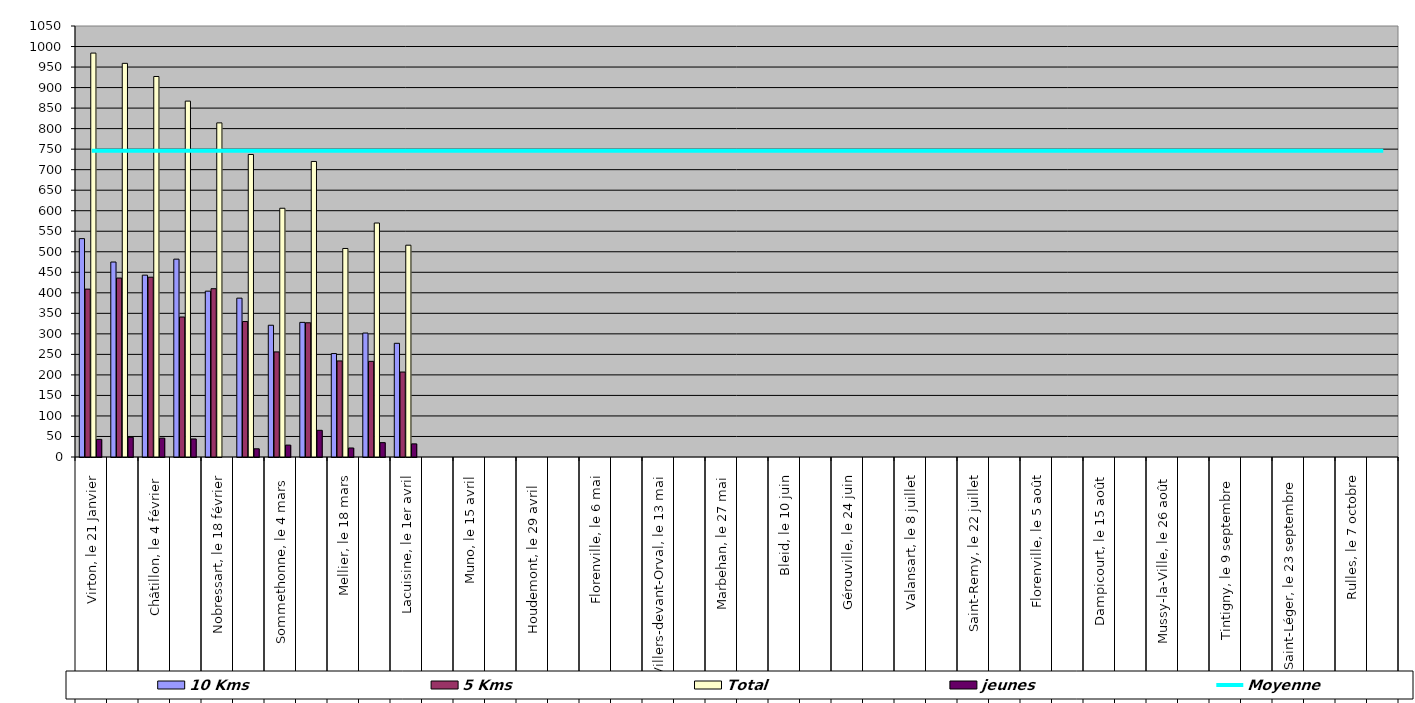
| Category | 10 Kms | 5 Kms | Total | jeunes |
|---|---|---|---|---|
| 0 | 532 | 409 | 984 | 43 |
| 1 | 475 | 436 | 959 | 48 |
| 2 | 443 | 438 | 927 | 46 |
| 3 | 482 | 341 | 867 | 44 |
| 4 | 404 | 410 | 814 | 0 |
| 5 | 387 | 330 | 737 | 20 |
| 6 | 321 | 256 | 606 | 29 |
| 7 | 328 | 327 | 720 | 65 |
| 8 | 252 | 234 | 508 | 22 |
| 9 | 302 | 233 | 570 | 35 |
| 10 | 277 | 207 | 516 | 32 |
| 11 | 0 | 0 | 0 | 0 |
| 12 | 0 | 0 | 0 | 0 |
| 13 | 0 | 0 | 0 | 0 |
| 14 | 0 | 0 | 0 | 0 |
| 15 | 0 | 0 | 0 | 0 |
| 16 | 0 | 0 | 0 | 0 |
| 17 | 0 | 0 | 0 | 0 |
| 18 | 0 | 0 | 0 | 0 |
| 19 | 0 | 0 | 0 | 0 |
| 20 | 0 | 0 | 0 | 0 |
| 21 | 0 | 0 | 0 | 0 |
| 22 | 0 | 0 | 0 | 0 |
| 23 | 0 | 0 | 0 | 0 |
| 24 | 0 | 0 | 0 | 0 |
| 25 | 0 | 0 | 0 | 0 |
| 26 | 0 | 0 | 0 | 0 |
| 27 | 0 | 0 | 0 | 0 |
| 28 | 0 | 0 | 0 | 0 |
| 29 | 0 | 0 | 0 | 0 |
| 30 | 0 | 0 | 0 | 0 |
| 31 | 0 | 0 | 0 | 0 |
| 32 | 0 | 0 | 0 | 0 |
| 33 | 0 | 0 | 0 | 0 |
| 34 | 0 | 0 | 0 | 0 |
| 35 | 0 | 0 | 0 | 0 |
| 36 | 0 | 0 | 0 | 0 |
| 37 | 0 | 0 | 0 | 0 |
| 38 | 0 | 0 | 0 | 0 |
| 39 | 0 | 0 | 0 | 0 |
| 40 | 0 | 0 | 0 | 0 |
| 41 | 0 | 0 | 0 | 0 |